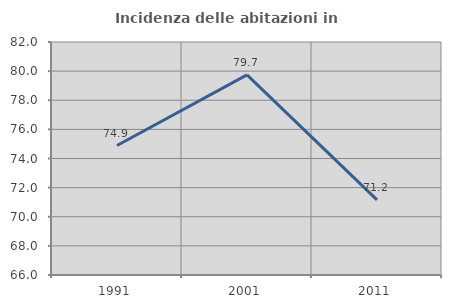
| Category | Incidenza delle abitazioni in proprietà  |
|---|---|
| 1991.0 | 74.892 |
| 2001.0 | 79.741 |
| 2011.0 | 71.158 |